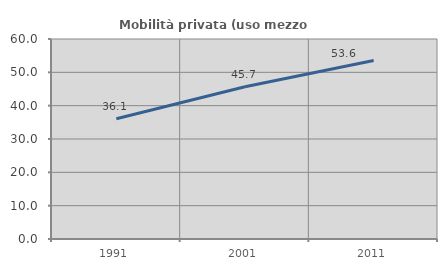
| Category | Mobilità privata (uso mezzo privato) |
|---|---|
| 1991.0 | 36.089 |
| 2001.0 | 45.66 |
| 2011.0 | 53.567 |